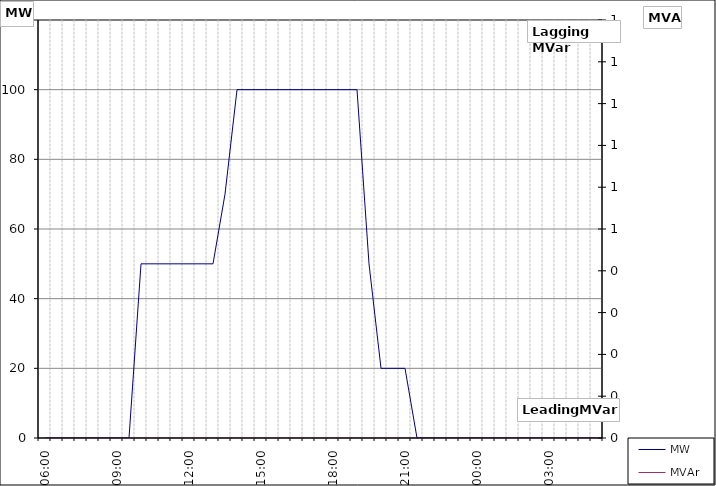
| Category | MW |
|---|---|
| 0.25 | 0 |
| 0.2708333333333333 | 0 |
| 0.291666666666667 | 0 |
| 0.3125 | 0 |
| 0.333333333333333 | 0 |
| 0.354166666666667 | 0 |
| 0.375 | 0 |
| 0.395833333333333 | 0 |
| 0.416666666666667 | 50 |
| 0.4375 | 50 |
| 0.458333333333333 | 50 |
| 0.479166666666666 | 50 |
| 0.5 | 50 |
| 0.520833333333333 | 50 |
| 0.541666666666666 | 50 |
| 0.5625 | 70 |
| 0.583333333333333 | 100 |
| 0.604166666666666 | 100 |
| 0.625 | 100 |
| 0.645833333333333 | 100 |
| 0.666666666666666 | 100 |
| 0.6875 | 100 |
| 0.708333333333333 | 100 |
| 0.729166666666666 | 100 |
| 0.75 | 100 |
| 0.770833333333333 | 100 |
| 0.791666666666666 | 100 |
| 0.8125 | 50 |
| 0.833333333333333 | 20 |
| 0.854166666666666 | 20 |
| 0.874999999999999 | 20 |
| 0.895833333333333 | 0 |
| 0.916666666666666 | 0 |
| 0.937499999999999 | 0 |
| 0.958333333333333 | 0 |
| 0.979166666666666 | 0 |
| 0.999999999999999 | 0 |
| 00:30 | 0 |
| 01:00 | 0 |
| 01:30 | 0 |
| 02:00 | 0 |
| 02:30 | 0 |
| 03:00 | 0 |
| 03:30 | 0 |
| 04:00 | 0 |
| 04:30 | 0 |
| 05:00 | 0 |